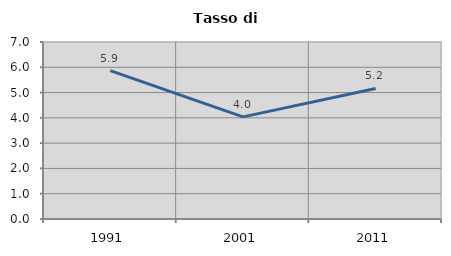
| Category | Tasso di disoccupazione   |
|---|---|
| 1991.0 | 5.868 |
| 2001.0 | 4.038 |
| 2011.0 | 5.161 |